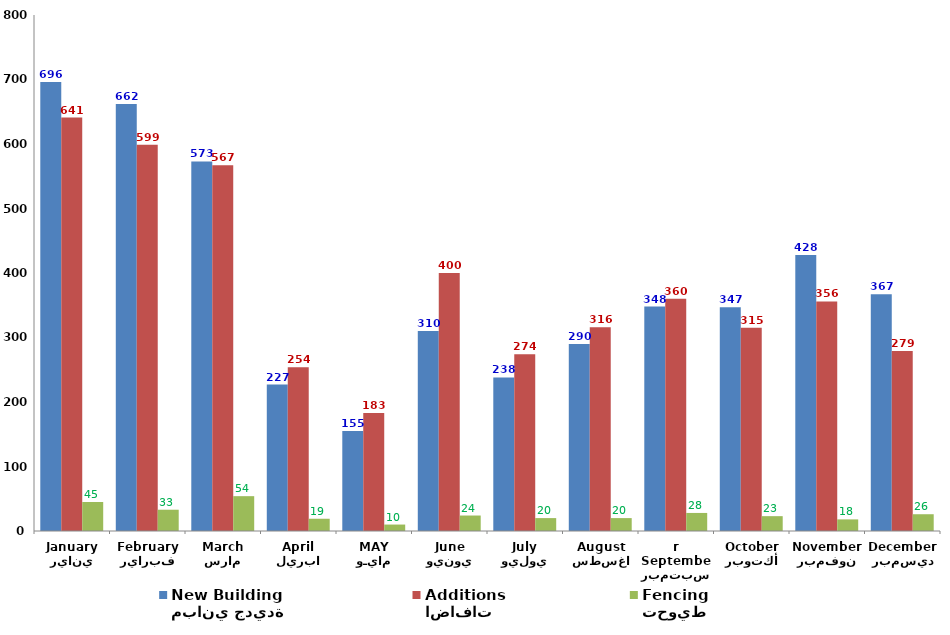
| Category | مباني جديدة
New Building | اضافات
Additions | تحويط
Fencing |
|---|---|---|---|
| يناير
January | 696 | 641 | 45 |
| فبراير
February | 662 | 599 | 33 |
| مارس
March | 573 | 567 | 54 |
| ابريل
April | 227 | 254 | 19 |
| مايـو
MAY | 155 | 183 | 10 |
| يونيو
June | 310 | 400 | 24 |
| يوليو
July | 238 | 274 | 20 |
| اغسطس
August | 290 | 316 | 20 |
| سبتمبر
September | 348 | 360 | 28 |
| أكتوبر
October | 347 | 315 | 23 |
| نوفمبر
November | 428 | 356 | 18 |
| ديسمبر
December | 367 | 279 | 26 |